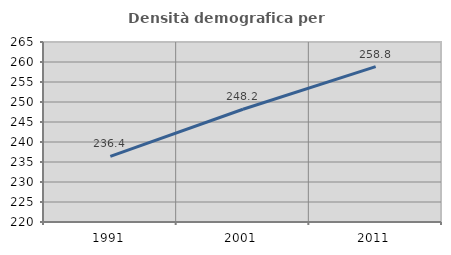
| Category | Densità demografica |
|---|---|
| 1991.0 | 236.404 |
| 2001.0 | 248.182 |
| 2011.0 | 258.836 |